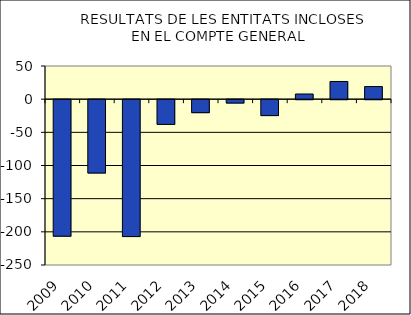
| Category |  RESULTATS DE LES ENTITATS INCLOSES EN EL COMPTE GENERAL  |
|---|---|
| 2009.0 | -205.8 |
| 2010.0 | -110.59 |
| 2011.0 | -206.43 |
| 2012.0 | -37.29 |
| 2013.0 | -19.59 |
| 2014.0 | -5.08 |
| 2015.0 | -24 |
| 2016.0 | 7.8 |
| 2017.0 | 26.66 |
| 2018.0 | 19.02 |